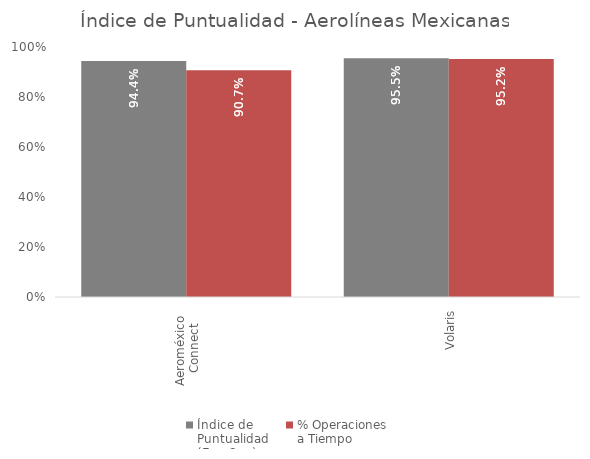
| Category | Índice de 
Puntualidad
(Ene-Sep) | % Operaciones 
a Tiempo |
|---|---|---|
| Aeroméxico 
Connect | 0.944 | 0.907 |
| Volaris | 0.955 | 0.952 |